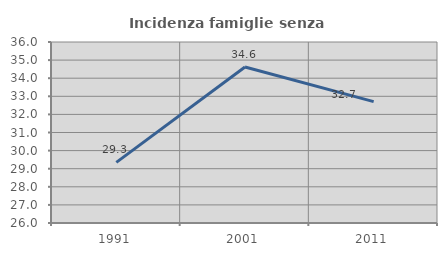
| Category | Incidenza famiglie senza nuclei |
|---|---|
| 1991.0 | 29.348 |
| 2001.0 | 34.615 |
| 2011.0 | 32.704 |